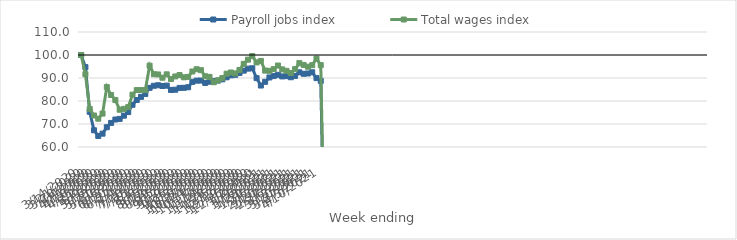
| Category | Payroll jobs index | Total wages index |
|---|---|---|
| 14/03/2020 | 100 | 100 |
| 21/03/2020 | 94.73 | 91.648 |
| 28/03/2020 | 75.306 | 76.591 |
| 04/04/2020 | 67.278 | 73.689 |
| 11/04/2020 | 64.799 | 72.303 |
| 18/04/2020 | 65.802 | 74.527 |
| 25/04/2020 | 68.604 | 86.04 |
| 02/05/2020 | 70.466 | 82.608 |
| 09/05/2020 | 71.953 | 80.399 |
| 16/05/2020 | 72.217 | 76.2 |
| 23/05/2020 | 73.621 | 76.569 |
| 30/05/2020 | 75.182 | 77.33 |
| 06/06/2020 | 78.369 | 82.761 |
| 13/06/2020 | 80.439 | 84.743 |
| 20/06/2020 | 81.796 | 84.743 |
| 27/06/2020 | 83.069 | 84.744 |
| 04/07/2020 | 85.729 | 95.357 |
| 11/07/2020 | 86.616 | 91.634 |
| 18/07/2020 | 86.853 | 91.547 |
| 25/07/2020 | 86.527 | 90.119 |
| 01/08/2020 | 86.69 | 91.603 |
| 08/08/2020 | 84.796 | 89.543 |
| 15/08/2020 | 84.909 | 90.677 |
| 22/08/2020 | 85.682 | 91.278 |
| 29/08/2020 | 85.738 | 90.302 |
| 05/09/2020 | 85.976 | 90.499 |
| 12/09/2020 | 88.329 | 92.834 |
| 19/09/2020 | 88.849 | 93.81 |
| 26/09/2020 | 88.89 | 93.403 |
| 03/10/2020 | 87.86 | 90.756 |
| 10/10/2020 | 88.382 | 90.475 |
| 17/10/2020 | 88.666 | 88.16 |
| 24/10/2020 | 88.887 | 88.966 |
| 31/10/2020 | 89.415 | 89.953 |
| 07/11/2020 | 90.311 | 91.864 |
| 14/11/2020 | 91.163 | 92.398 |
| 21/11/2020 | 91.398 | 91.99 |
| 28/11/2020 | 92.196 | 93.504 |
| 05/12/2020 | 93.205 | 96.161 |
| 12/12/2020 | 94.075 | 97.969 |
| 19/12/2020 | 94.232 | 99.548 |
| 26/12/2020 | 89.955 | 96.769 |
| 02/01/2021 | 86.725 | 97.433 |
| 09/01/2021 | 88.346 | 93.219 |
| 16/01/2021 | 90.234 | 93.125 |
| 23/01/2021 | 90.837 | 93.858 |
| 30/01/2021 | 91.382 | 95.42 |
| 06/02/2021 | 90.685 | 93.743 |
| 13/02/2021 | 90.827 | 93.109 |
| 20/02/2021 | 90.333 | 92.16 |
| 27/02/2021 | 90.911 | 93.856 |
| 06/03/2021 | 92.472 | 96.456 |
| 13/03/2021 | 91.834 | 95.686 |
| 20/03/2021 | 91.959 | 94.893 |
| 27/03/2021 | 92.482 | 95.575 |
| 03/04/2021 | 89.956 | 98.433 |
| 10/04/2021 | 88.755 | 95.594 |